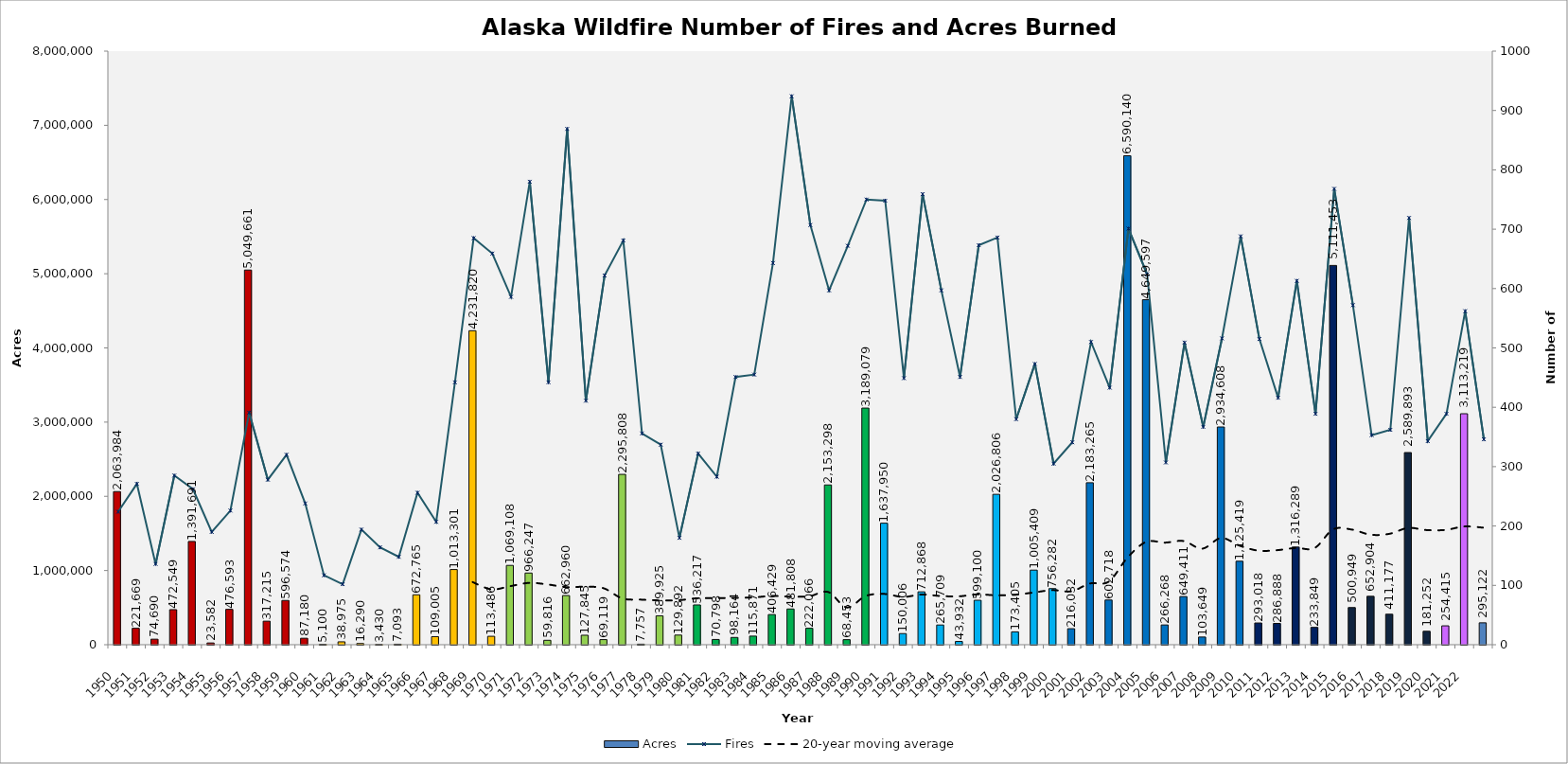
| Category | Acres |
|---|---|
| 1950.0 | 2063984 |
| 1951.0 | 221669 |
| 1952.0 | 74690 |
| 1953.0 | 472549 |
| 1954.0 | 1391691 |
| 1955.0 | 23582 |
| 1956.0 | 476593 |
| 1957.0 | 5049661 |
| 1958.0 | 317215 |
| 1959.0 | 596574 |
| 1960.0 | 87180 |
| 1961.0 | 5100 |
| 1962.0 | 38975 |
| 1963.0 | 16290 |
| 1964.0 | 3430 |
| 1965.0 | 7093 |
| 1966.0 | 672765 |
| 1967.0 | 109005 |
| 1968.0 | 1013301 |
| 1969.0 | 4231820 |
| 1970.0 | 113486 |
| 1971.0 | 1069108 |
| 1972.0 | 966247 |
| 1973.0 | 59816 |
| 1974.0 | 662960 |
| 1975.0 | 127845 |
| 1976.0 | 69119 |
| 1977.0 | 2295808 |
| 1978.0 | 7757 |
| 1979.0 | 389925 |
| 1980.0 | 129892 |
| 1981.0 | 536217 |
| 1982.0 | 70798 |
| 1983.0 | 98164 |
| 1984.0 | 115871 |
| 1985.0 | 406429 |
| 1986.0 | 481808 |
| 1987.0 | 222066 |
| 1988.0 | 2153298 |
| 1989.0 | 68453 |
| 1990.0 | 3189079 |
| 1991.0 | 1637950 |
| 1992.0 | 150006 |
| 1993.0 | 712868 |
| 1994.0 | 265709 |
| 1995.0 | 43932 |
| 1996.0 | 599100 |
| 1997.0 | 2026806 |
| 1998.0 | 173405 |
| 1999.0 | 1005409 |
| 2000.0 | 756282 |
| 2001.0 | 216032 |
| 2002.0 | 2183265 |
| 2003.0 | 602718 |
| 2004.0 | 6590140 |
| 2005.0 | 4649597 |
| 2006.0 | 266267.8 |
| 2007.0 | 649411 |
| 2008.0 | 103649 |
| 2009.0 | 2934608 |
| 2010.0 | 1125419 |
| 2011.0 | 293018 |
| 2012.0 | 286888 |
| 2013.0 | 1316288.5 |
| 2014.0 | 233849.3 |
| 2015.0 | 5111452.5 |
| 2016.0 | 500949.3 |
| 2017.0 | 652904 |
| 2018.0 | 411177 |
| 2019.0 | 2589893 |
| 2020.0 | 181252 |
| 2021.0 | 254415 |
| 2022.0 | 3113219 |